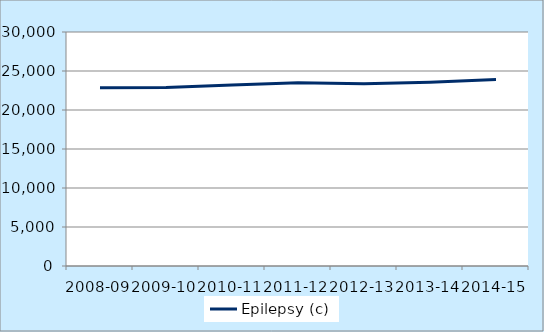
| Category | Epilepsy (c) |
|---|---|
| 2008-09 | 22842 |
| 2009-10 | 22885 |
| 2010-11 | 23194 |
| 2011-12 | 23479 |
| 2012-13 | 23373 |
| 2013-14 | 23545 |
| 2014-15 | 23896 |